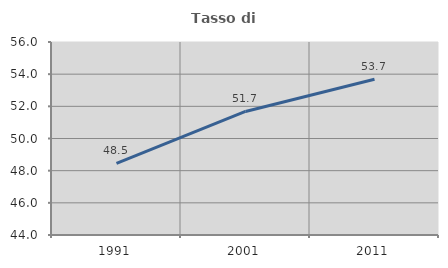
| Category | Tasso di occupazione   |
|---|---|
| 1991.0 | 48.455 |
| 2001.0 | 51.683 |
| 2011.0 | 53.688 |